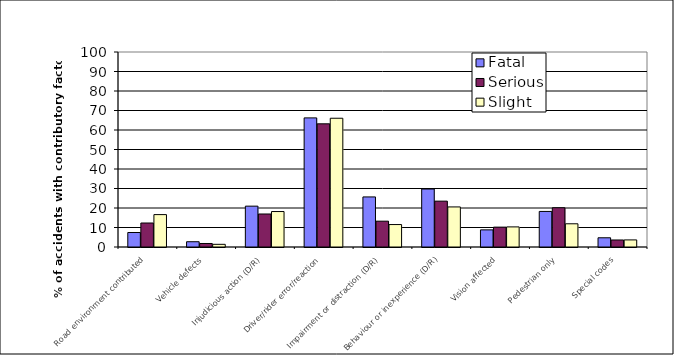
| Category | Fatal | Serious | Slight |
|---|---|---|---|
| Road environment contributed | 7.432 | 12.304 | 16.618 |
| Vehicle defects | 2.703 | 1.803 | 1.375 |
| Injudicious action (D/R) | 20.946 | 16.928 | 18.189 |
| Driver/rider error/reaction | 66.216 | 63.166 | 66.028 |
| Impairment or distraction (D/R) | 25.676 | 13.245 | 11.512 |
| Behaviour or inexperience (D/R) | 29.73 | 23.511 | 20.545 |
| Vision affected | 8.784 | 10.188 | 10.309 |
| Pedestrian only | 18.243 | 20.141 | 11.905 |
| Special codes | 4.73 | 3.605 | 3.633 |